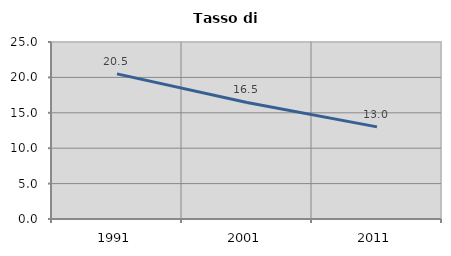
| Category | Tasso di disoccupazione   |
|---|---|
| 1991.0 | 20.503 |
| 2001.0 | 16.458 |
| 2011.0 | 13.008 |